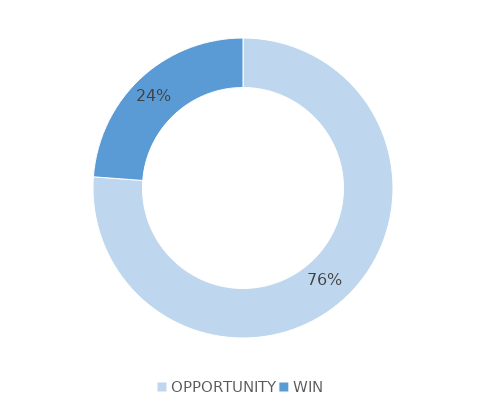
| Category | Series 0 |
|---|---|
| OPPORTUNITY | 16 |
| WIN | 5 |